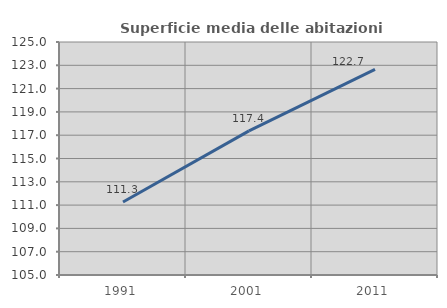
| Category | Superficie media delle abitazioni occupate |
|---|---|
| 1991.0 | 111.261 |
| 2001.0 | 117.369 |
| 2011.0 | 122.656 |